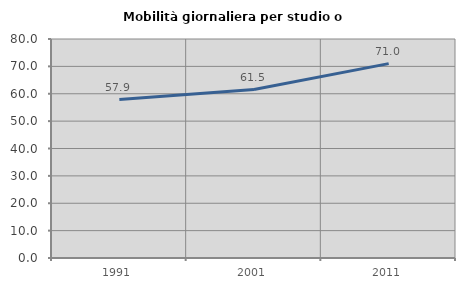
| Category | Mobilità giornaliera per studio o lavoro |
|---|---|
| 1991.0 | 57.878 |
| 2001.0 | 61.533 |
| 2011.0 | 70.997 |